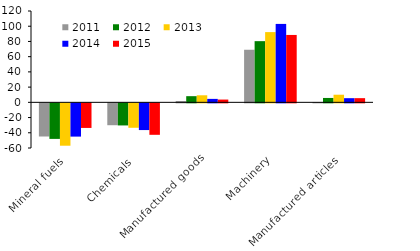
| Category | 2011 | 2012 | 2013 | 2014 | 2015 |
|---|---|---|---|---|---|
| Mineral fuels | -43.583 | -46.726 | -55.683 | -43.723 | -32.325 |
| Chemicals | -28.755 | -29.043 | -32.11 | -35.122 | -41.362 |
| Manufactured goods | 1.723 | 8.097 | 9.267 | 4.524 | 3.638 |
| Machinery | 69.08 | 80.381 | 92.283 | 103.038 | 88.534 |
| Manufactured articles | 0.3 | 5.746 | 10.005 | 5.452 | 5.488 |